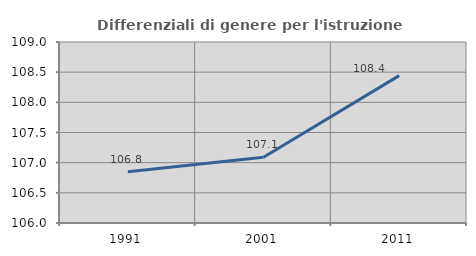
| Category | Differenziali di genere per l'istruzione superiore |
|---|---|
| 1991.0 | 106.848 |
| 2001.0 | 107.09 |
| 2011.0 | 108.443 |